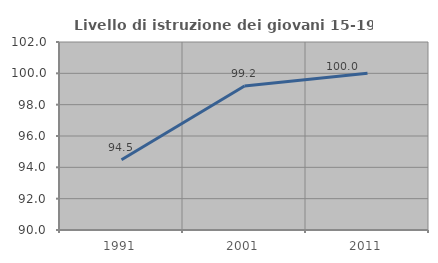
| Category | Livello di istruzione dei giovani 15-19 anni |
|---|---|
| 1991.0 | 94.479 |
| 2001.0 | 99.194 |
| 2011.0 | 100 |